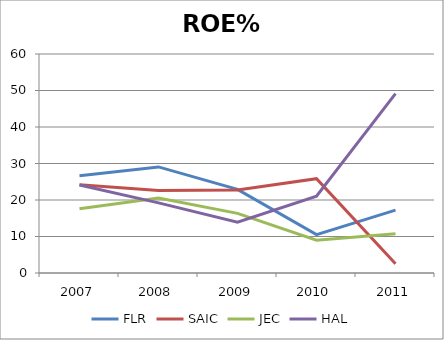
| Category | FLR | SAIC | JEC | HAL |
|---|---|---|---|---|
| 2007.0 | 26.63 | 24.15 | 17.58 | 24.09 |
| 2008.0 | 29.06 | 22.62 | 20.52 | 19.21 |
| 2009.0 | 22.92 | 22.72 | 16.33 | 13.92 |
| 2010.0 | 10.51 | 25.85 | 8.99 | 21.02 |
| 2011.0 | 17.23 | 2.53 | 10.76 | 49.14 |